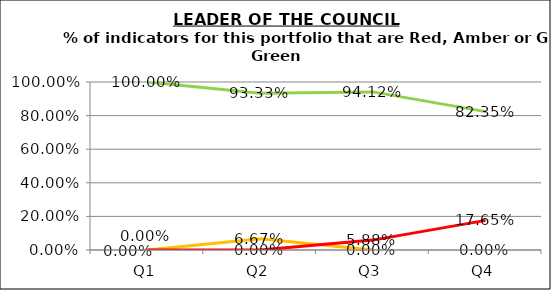
| Category | Green | Amber | Red |
|---|---|---|---|
| Q1 | 1 | 0 | 0 |
| Q2 | 0.933 | 0.067 | 0 |
| Q3 | 0.941 | 0 | 0.059 |
| Q4 | 0.824 | 0 | 0.176 |